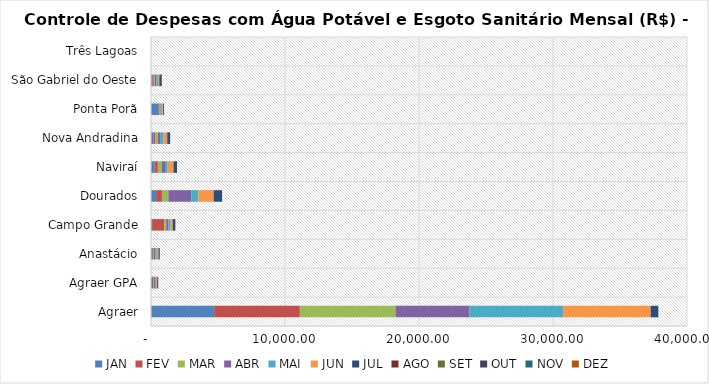
| Category | JAN | FEV | MAR | ABR | MAI | JUN | JUL | AGO | SET | OUT | NOV | DEZ |
|---|---|---|---|---|---|---|---|---|---|---|---|---|
| Agraer | 4715.17 | 6391.81 | 7142.94 | 5497.48 | 7013.13 | 6528.39 | 574.05 | 0 | 0 | 0 | 0 | 0 |
| Agraer GPA | 72.32 | 75.78 | 79.8 | 76.16 | 77.41 | 78.77 | 80.21 | 0 | 0 | 0 | 0 | 0 |
| Anastácio | 79.23 | 65.43 | 79.23 | 92.64 | 120.63 | 120.63 | 95.97 | 0 | 0 | 0 | 0 | 0 |
| Campo Grande | 81.2 | 903.3 | 152.7 | 163.2 | 156.3 | 163.2 | 197.71 | 0 | 0 | 0 | 0 | 0 |
| Dourados | 379.75 | 436.3 | 479.05 | 1718.8 | 518.35 | 1145.8 | 629.16 | 0 | 0 | 0 | 0 | 0 |
| Naviraí | 261.65 | 247.85 | 282.35 | 251.3 | 199.55 | 434.15 | 263.92 | 0 | 0 | 0 | 0 | 0 |
| Nova Andradina | 186.17 | 153.29 | 170.75 | 167.09 | 256.01 | 277.7 | 219.82 | 0 | 0 | 0 | 0 | 0 |
| Ponta Porã | 587.23 | 57.05 | 67.4 | 77.75 | 57.05 | 57.05 | 69.82 | 0 | 0 | 0 | 0 | 0 |
| São Gabriel do Oeste | 95 | 115.7 | 81.2 | 112.25 | 126.05 | 91.55 | 184.18 | 0 | 0 | 0 | 0 | 0 |
| Três Lagoas | 0 | 0 | 0 | 0 | 0 | 0 | 0 | 0 | 0 | 0 | 0 | 0 |